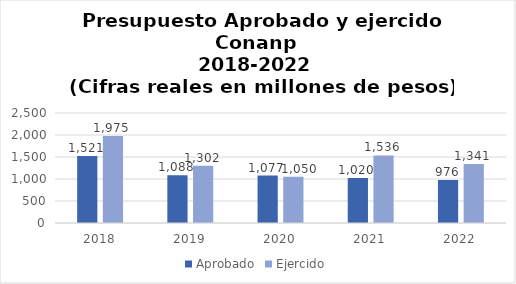
| Category | Aprobado | Ejercido |
|---|---|---|
| 2018.0 | 1520.63 | 1975 |
| 2019.0 | 1088 | 1302 |
| 2020.0 | 1077 | 1050 |
| 2021.0 | 1020 | 1536 |
| 2022.0 | 976 | 1341 |